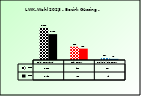
| Category | 2018 | 2023 |
|---|---|---|
| Bgld. Bauernbund | 2230 | 1798 |
| SPÖ Bauern | 923 | 788 |
| Freiheitliche Bauern | 127 | 79 |